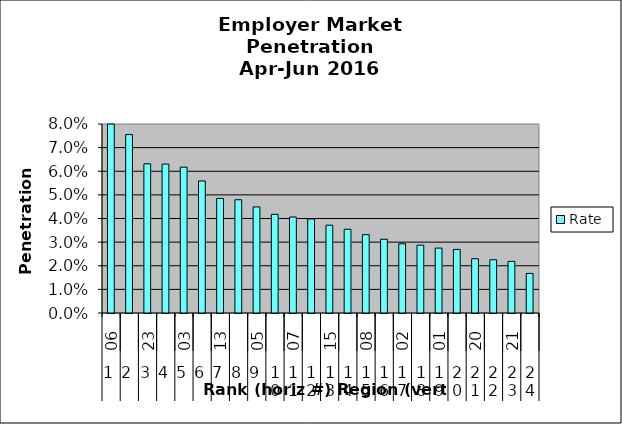
| Category | Rate |
|---|---|
| 0 | 0.09 |
| 1 | 0.076 |
| 2 | 0.063 |
| 3 | 0.063 |
| 4 | 0.062 |
| 5 | 0.056 |
| 6 | 0.049 |
| 7 | 0.048 |
| 8 | 0.045 |
| 9 | 0.042 |
| 10 | 0.041 |
| 11 | 0.04 |
| 12 | 0.037 |
| 13 | 0.035 |
| 14 | 0.033 |
| 15 | 0.031 |
| 16 | 0.029 |
| 17 | 0.029 |
| 18 | 0.027 |
| 19 | 0.027 |
| 20 | 0.023 |
| 21 | 0.023 |
| 22 | 0.022 |
| 23 | 0.017 |